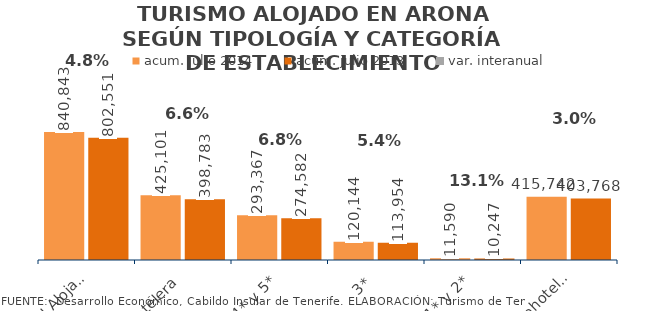
| Category | acum. julio 2014 | acum. julio 2013 |
|---|---|---|
| Total Alojados | 840843 | 802551 |
| Hotelera | 425101 | 398783 |
| 4* y 5* | 293367 | 274582 |
| 3* | 120144 | 113954 |
| 1* y 2* | 11590 | 10247 |
| Extrahotelera | 415742 | 403768 |